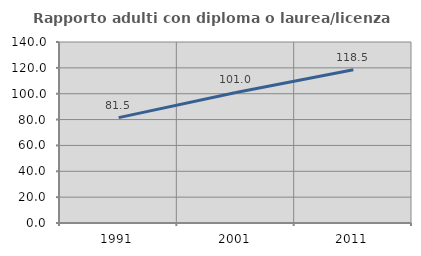
| Category | Rapporto adulti con diploma o laurea/licenza media  |
|---|---|
| 1991.0 | 81.509 |
| 2001.0 | 100.971 |
| 2011.0 | 118.471 |